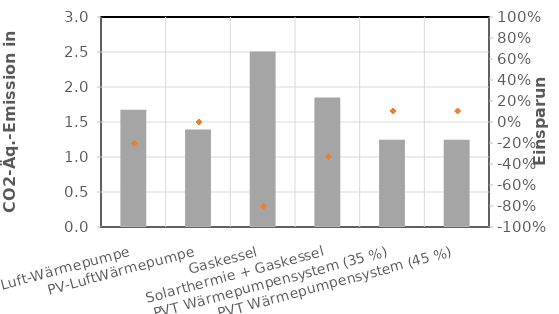
| Category | Emissionen CO2-Äq. |
|---|---|
| Luft-Wärmepumpe | 1.676 |
| PV-LuftWärmepumpe | 1.392 |
| Gaskessel | 2.509 |
| Solarthermie + Gaskessel | 1.85 |
| PVT Wärmepumpensystem (35 %) | 1.246 |
| PVT Wärmepumpensystem (45 %) | 1.246 |